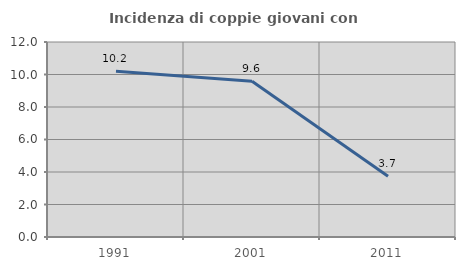
| Category | Incidenza di coppie giovani con figli |
|---|---|
| 1991.0 | 10.204 |
| 2001.0 | 9.583 |
| 2011.0 | 3.743 |